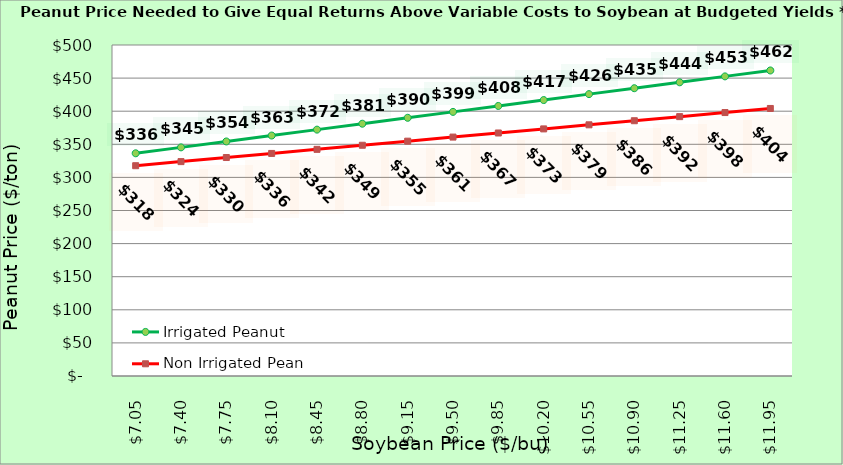
| Category | Irrigated Peanut | Non Irrigated Peanut |
|---|---|---|
| 7.0500000000000025 | 336.423 | 317.669 |
| 7.400000000000002 | 345.359 | 323.845 |
| 7.750000000000002 | 354.295 | 330.022 |
| 8.100000000000001 | 363.231 | 336.198 |
| 8.450000000000001 | 372.167 | 342.375 |
| 8.8 | 381.104 | 348.551 |
| 9.15 | 390.04 | 354.728 |
| 9.5 | 398.976 | 360.904 |
| 9.85 | 407.912 | 367.081 |
| 10.2 | 416.848 | 373.257 |
| 10.549999999999999 | 425.784 | 379.434 |
| 10.899999999999999 | 434.721 | 385.61 |
| 11.249999999999998 | 443.657 | 391.787 |
| 11.599999999999998 | 452.593 | 397.963 |
| 11.949999999999998 | 461.529 | 404.14 |